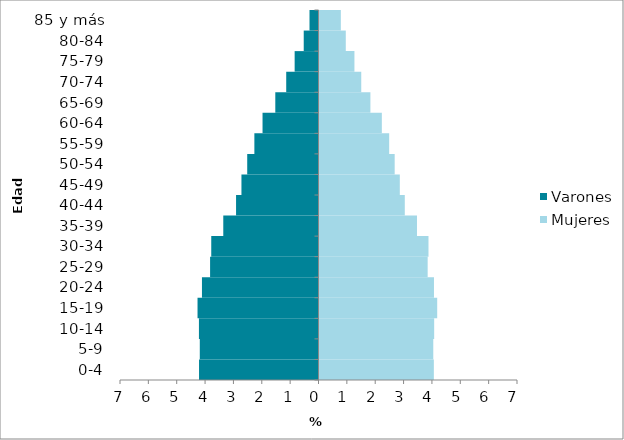
| Category | Varones | Mujeres |
|---|---|---|
| 0-4 | -4.213 | 4.068 |
| 5-9 | -4.186 | 4.048 |
| 10-14 | -4.216 | 4.079 |
| 15-19 | -4.266 | 4.186 |
| 20-24 | -4.11 | 4.072 |
| 25-29 | -3.823 | 3.85 |
| 30-34 | -3.782 | 3.879 |
| 35-39 | -3.358 | 3.473 |
| 40-44 | -2.907 | 3.043 |
| 45-49 | -2.717 | 2.867 |
| 50-54 | -2.514 | 2.686 |
| 55-59 | -2.262 | 2.492 |
| 60-64 | -1.973 | 2.234 |
| 65-69 | -1.523 | 1.83 |
| 70-74 | -1.138 | 1.507 |
| 75-79 | -0.841 | 1.267 |
| 80-84 | -0.521 | 0.962 |
| 85 y más | -0.317 | 0.788 |